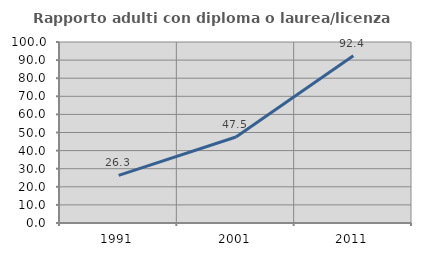
| Category | Rapporto adulti con diploma o laurea/licenza media  |
|---|---|
| 1991.0 | 26.316 |
| 2001.0 | 47.518 |
| 2011.0 | 92.442 |